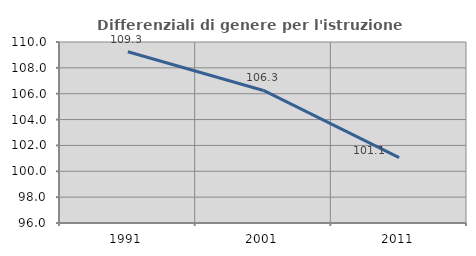
| Category | Differenziali di genere per l'istruzione superiore |
|---|---|
| 1991.0 | 109.251 |
| 2001.0 | 106.252 |
| 2011.0 | 101.056 |